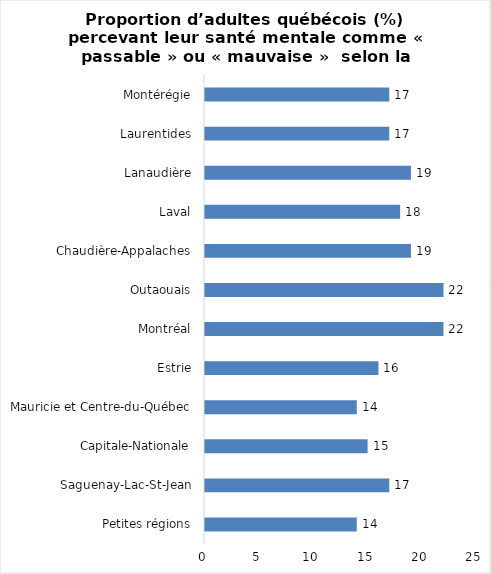
| Category | Series 0 |
|---|---|
| Petites régions | 14 |
| Saguenay-Lac-St-Jean | 17 |
| Capitale-Nationale | 15 |
| Mauricie et Centre-du-Québec | 14 |
| Estrie | 16 |
| Montréal | 22 |
| Outaouais | 22 |
| Chaudière-Appalaches | 19 |
| Laval | 18 |
| Lanaudière | 19 |
| Laurentides | 17 |
| Montérégie | 17 |